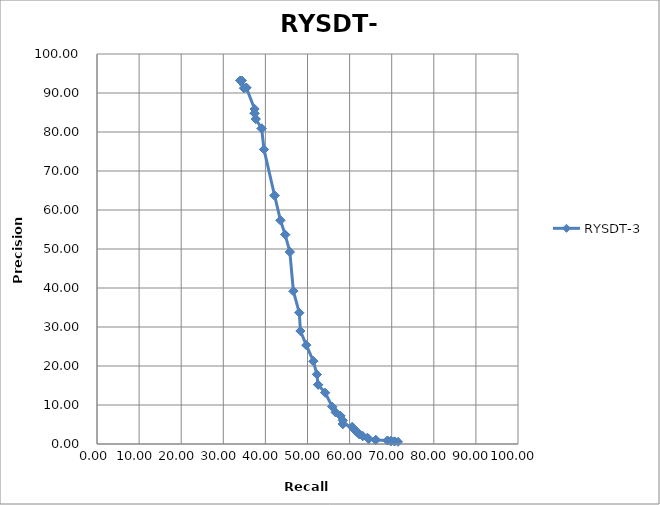
| Category | RYSDT-3 |
|---|---|
| 34.078 | 93.13 |
| 34.078 | 93.13 |
| 34.078 | 93.13 |
| 34.078 | 93.13 |
| 34.078 | 93.13 |
| 34.078 | 93.13 |
| 34.078 | 93.13 |
| 34.078 | 93.13 |
| 34.078 | 93.13 |
| 34.078 | 93.13 |
| 34.358 | 93.182 |
| 34.358 | 93.182 |
| 34.358 | 93.182 |
| 34.916 | 91.241 |
| 34.916 | 91.241 |
| 35.475 | 91.367 |
| 35.475 | 91.367 |
| 35.475 | 91.367 |
| 37.43 | 85.897 |
| 37.43 | 85.897 |
| 37.43 | 84.81 |
| 37.43 | 84.81 |
| 37.43 | 84.81 |
| 37.709 | 83.333 |
| 37.709 | 83.333 |
| 39.106 | 80.925 |
| 39.106 | 80.925 |
| 39.106 | 80.925 |
| 39.665 | 75.532 |
| 39.665 | 75.532 |
| 42.179 | 63.713 |
| 42.179 | 63.713 |
| 42.179 | 63.713 |
| 43.575 | 57.353 |
| 43.575 | 57.353 |
| 44.693 | 53.691 |
| 44.693 | 53.691 |
| 44.693 | 53.691 |
| 45.81 | 49.249 |
| 45.81 | 49.249 |
| 46.648 | 39.202 |
| 46.648 | 39.202 |
| 46.648 | 39.202 |
| 48.045 | 33.659 |
| 48.045 | 33.659 |
| 48.324 | 28.978 |
| 48.324 | 28.978 |
| 48.324 | 28.978 |
| 49.721 | 25.356 |
| 49.721 | 25.356 |
| 51.397 | 21.247 |
| 51.397 | 21.247 |
| 51.397 | 21.247 |
| 52.235 | 17.844 |
| 52.235 | 17.844 |
| 52.514 | 15.21 |
| 52.514 | 15.21 |
| 52.514 | 15.21 |
| 54.19 | 13.161 |
| 54.19 | 13.161 |
| 55.866 | 9.56 |
| 55.866 | 9.56 |
| 55.866 | 9.56 |
| 56.704 | 8.094 |
| 56.704 | 8.094 |
| 57.821 | 7.218 |
| 57.821 | 7.218 |
| 57.821 | 7.218 |
| 58.38 | 6.083 |
| 58.38 | 6.083 |
| 58.38 | 5.128 |
| 58.38 | 5.128 |
| 58.38 | 5.128 |
| 60.615 | 4.383 |
| 60.615 | 4.383 |
| 61.173 | 3.691 |
| 61.173 | 3.691 |
| 61.173 | 3.691 |
| 61.732 | 3.084 |
| 61.732 | 3.084 |
| 62.291 | 2.539 |
| 62.291 | 2.539 |
| 62.291 | 2.539 |
| 63.128 | 2.017 |
| 63.128 | 2.017 |
| 64.246 | 1.581 |
| 64.246 | 1.581 |
| 64.246 | 1.581 |
| 64.525 | 1.266 |
| 64.525 | 1.266 |
| 66.201 | 1.039 |
| 66.201 | 1.039 |
| 66.201 | 1.039 |
| 68.994 | 0.884 |
| 68.994 | 0.884 |
| 69.832 | 0.765 |
| 69.832 | 0.765 |
| 69.832 | 0.765 |
| 70.67 | 0.665 |
| 70.67 | 0.665 |
| 71.508 | 0.564 |